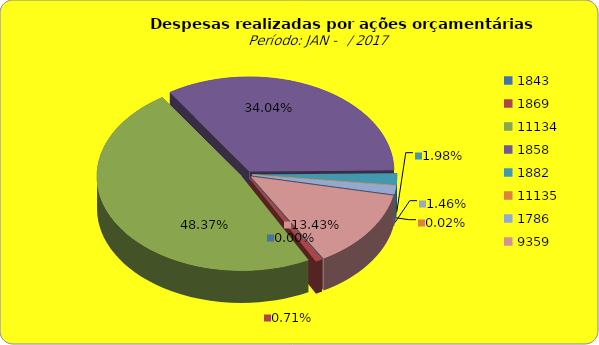
| Category | Series 1 |
|---|---|
| 1843.0 | 0 |
| 1869.0 | 243745.74 |
| 11134.0 | 16592775.96 |
| 1858.0 | 11675246.36 |
| 1882.0 | 680149.11 |
| 11135.0 | 6197 |
| 1786.0 | 499568.74 |
| 9359.0 | 4605841.32 |